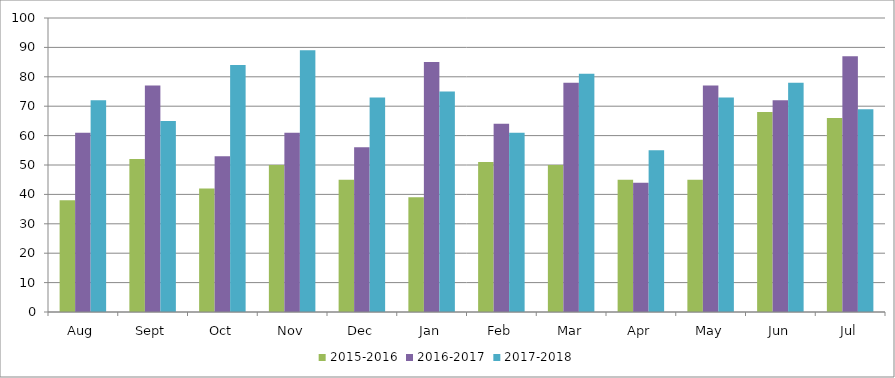
| Category | 2015-2016 | 2016-2017 | 2017-2018 |
|---|---|---|---|
| Aug | 38 | 61 | 72 |
| Sept | 52 | 77 | 65 |
| Oct | 42 | 53 | 84 |
| Nov | 50 | 61 | 89 |
| Dec | 45 | 56 | 73 |
| Jan | 39 | 85 | 75 |
| Feb | 51 | 64 | 61 |
| Mar | 50 | 78 | 81 |
| Apr | 45 | 44 | 55 |
| May | 45 | 77 | 73 |
| Jun | 68 | 72 | 78 |
| Jul | 66 | 87 | 69 |